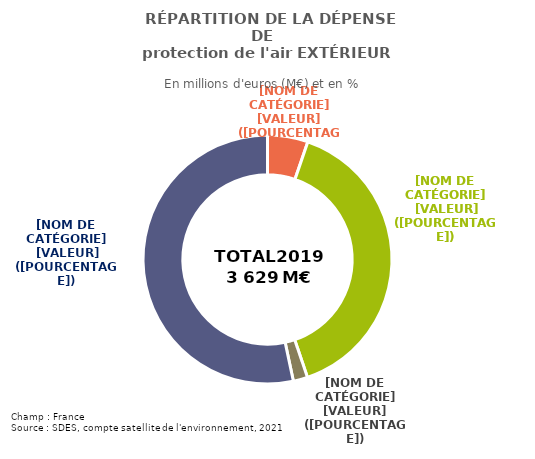
| Category | Series 0 |
|---|---|
| Autres | 190.837 |
| Adaptation des procédés de production | 1434.959 |
| Surveillance et contrôle | 67.8 |
| Produits connexes et adaptés | 1935.612 |